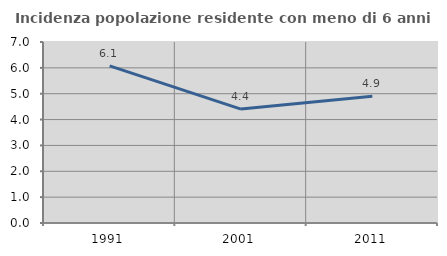
| Category | Incidenza popolazione residente con meno di 6 anni |
|---|---|
| 1991.0 | 6.077 |
| 2001.0 | 4.404 |
| 2011.0 | 4.9 |